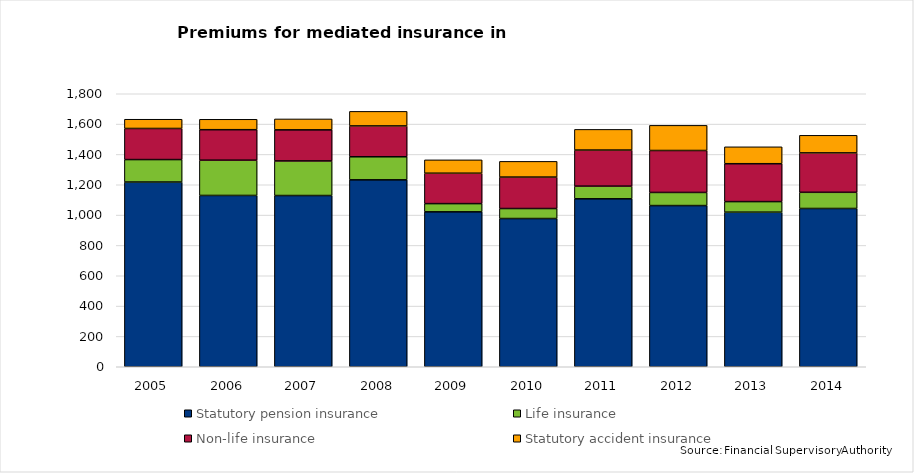
| Category | Statutory pension insurance | Life insurance | Non-life insurance | Statutory accident insurance |
|---|---|---|---|---|
| 2005.0 | 1218 | 148 | 205 | 61 |
| 2006.0 | 1129.49 | 232.47 | 201.056 | 68.612 |
| 2007.0 | 1129 | 228 | 205 | 72 |
| 2008.0 | 1232.449 | 151.996 | 203.425 | 95.962 |
| 2009.0 | 1021.457 | 54.107 | 200.56 | 88.041 |
| 2010.0 | 977.321 | 65.95 | 207.341 | 103.558 |
| 2011.0 | 1107.329 | 83.403 | 238.041 | 136.289 |
| 2012.0 | 1062.705 | 86.597 | 276.62 | 165.706 |
| 2013.0 | 1019.216 | 69.648 | 249.823 | 111.515 |
| 2014.0 | 1043.573 | 106.619 | 259.835 | 115.957 |